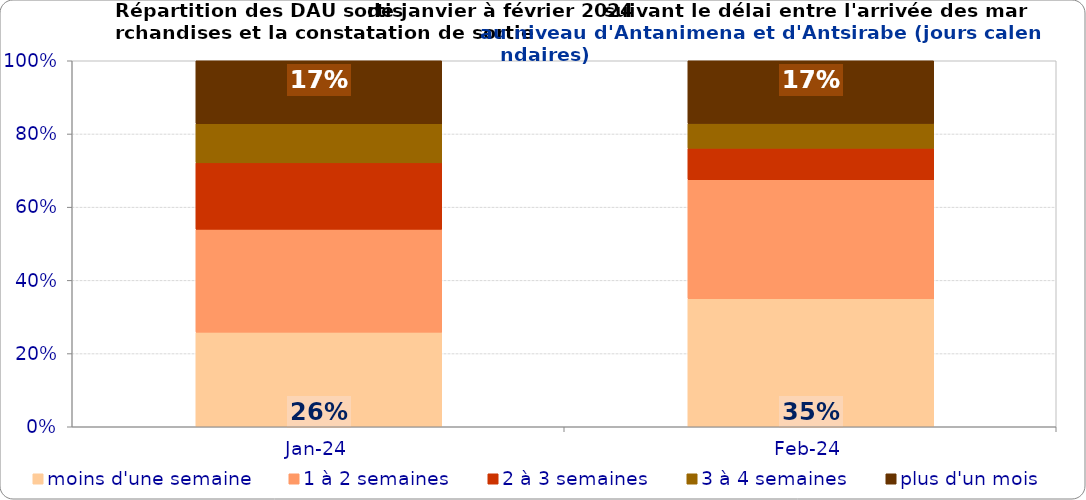
| Category | moins d'une semaine | 1 à 2 semaines | 2 à 3 semaines | 3 à 4 semaines | plus d'un mois |
|---|---|---|---|---|---|
| 2024-01-01 | 0.258 | 0.281 | 0.182 | 0.107 | 0.172 |
| 2024-02-01 | 0.35 | 0.325 | 0.086 | 0.068 | 0.171 |